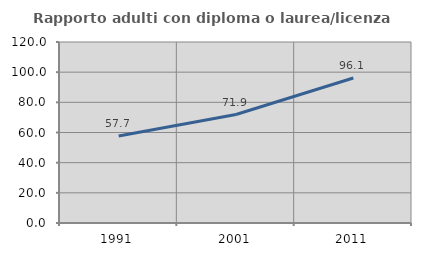
| Category | Rapporto adulti con diploma o laurea/licenza media  |
|---|---|
| 1991.0 | 57.653 |
| 2001.0 | 71.918 |
| 2011.0 | 96.104 |